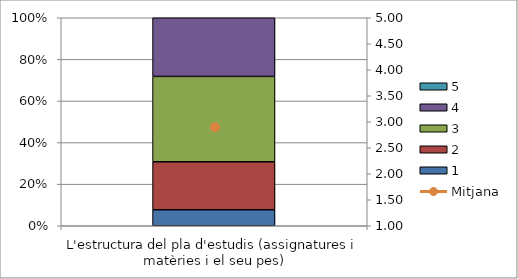
| Category | 1 | 2 | 3 | 4 | 5 |
|---|---|---|---|---|---|
| L'estructura del pla d'estudis (assignatures i matèries i el seu pes) | 3 | 9 | 16 | 11 | 0 |